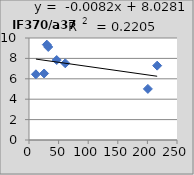
| Category | IF370/a370 |
|---|---|
| 25.5 | 6.52 |
| 61.3 | 7.52 |
| 11.7 | 6.44 |
| 216.5 | 7.29 |
| 46.8 | 7.84 |
| 32.5 | 9.12 |
| 200.8 | 5.01 |
| 30.1 | 9.35 |